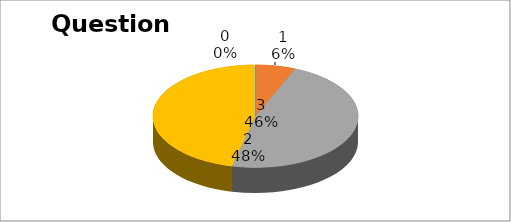
| Category | Series 0 |
|---|---|
| 0 | 0 |
| 1 | 6 |
| 2 | 45 |
| 3 | 44 |